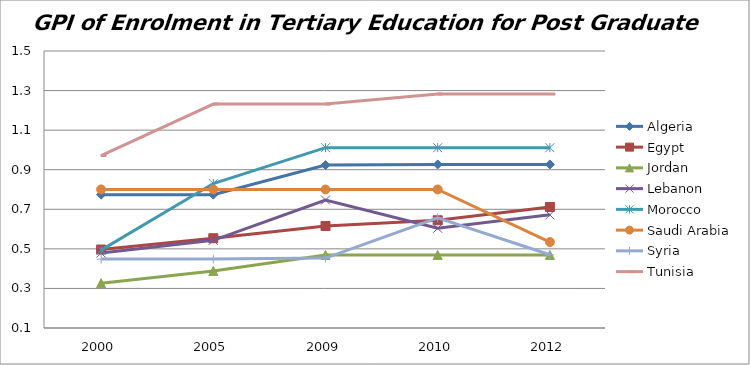
| Category | Algeria | Egypt | Jordan | Lebanon | Morocco | Saudi Arabia | Syria | Tunisia |
|---|---|---|---|---|---|---|---|---|
| 2000.0 | 0.774 | 0.497 | 0.327 | 0.479 | 0.494 | 0.8 | 0.448 | 0.972 |
| 2005.0 | 0.774 | 0.554 | 0.389 | 0.543 | 0.83 | 0.8 | 0.448 | 1.232 |
| 2009.0 | 0.923 | 0.615 | 0.469 | 0.747 | 1.011 | 0.8 | 0.454 | 1.232 |
| 2010.0 | 0.927 | 0.645 | 0.469 | 0.604 | 1.011 | 0.8 | 0.657 | 1.282 |
| 2012.0 | 0.927 | 0.712 | 0.469 | 0.672 | 1.011 | 0.534 | 0.47 | 1.282 |